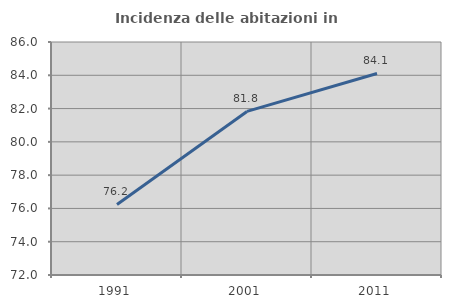
| Category | Incidenza delle abitazioni in proprietà  |
|---|---|
| 1991.0 | 76.239 |
| 2001.0 | 81.83 |
| 2011.0 | 84.111 |